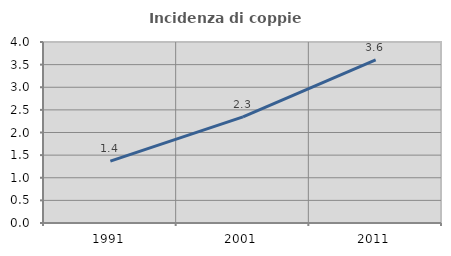
| Category | Incidenza di coppie miste |
|---|---|
| 1991.0 | 1.366 |
| 2001.0 | 2.346 |
| 2011.0 | 3.604 |